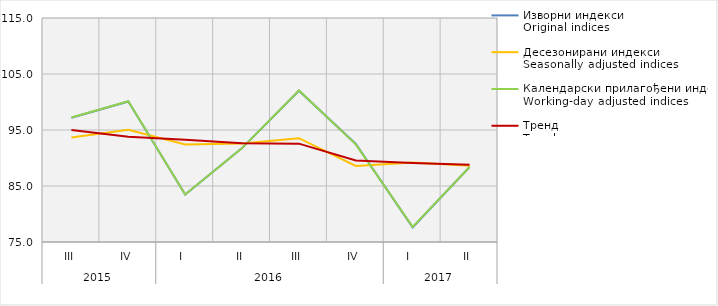
| Category | Изворни индекси
Original indices | Десезонирани индекси
Seasonally adjusted indices | Календарски прилагођени индекси
Working-day adjusted indices | Тренд
Trend |
|---|---|---|---|---|
| 0 | 97.2 | 93.654 | 97.22 | 94.987 |
| 1 | 100.1 | 95.036 | 100.126 | 93.78 |
| 2 | 83.476 | 92.405 | 83.476 | 93.237 |
| 3 | 91.763 | 92.587 | 91.763 | 92.614 |
| 4 | 102.022 | 93.535 | 102.057 | 92.562 |
| 5 | 92.509 | 88.589 | 92.439 | 89.549 |
| 6 | 77.626 | 89.206 | 77.697 | 89.095 |
| 7 | 88.392 | 88.607 | 88.392 | 88.817 |